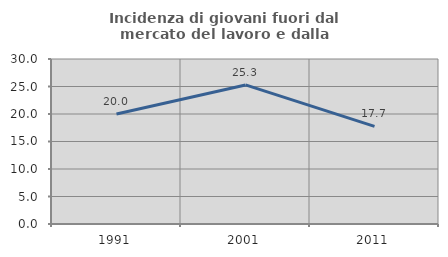
| Category | Incidenza di giovani fuori dal mercato del lavoro e dalla formazione  |
|---|---|
| 1991.0 | 20 |
| 2001.0 | 25.283 |
| 2011.0 | 17.745 |